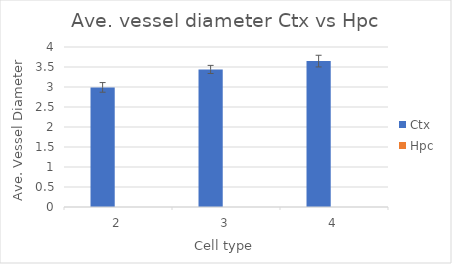
| Category | Ctx | Hpc |
|---|---|---|
| 2.0 | 2.99 |  |
| 3.0 | 3.439 |  |
| 4.0 | 3.647 |  |